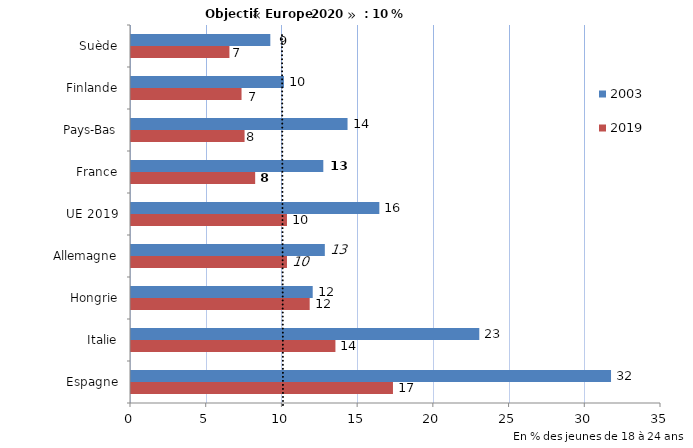
| Category | 2019 | 2003 |
|---|---|---|
| Espagne | 17.3 | 31.7 |
| Italie | 13.5 | 23 |
| Hongrie | 11.8 | 12 |
| Allemagne | 10.3 | 12.8 |
| UE 2019 | 10.3 | 16.4 |
| France | 8.2 | 12.7 |
| Pays-Bas | 7.5 | 14.3 |
| Finlande | 7.3 | 10.1 |
| Suède | 6.5 | 9.2 |